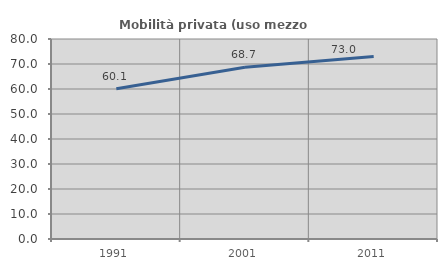
| Category | Mobilità privata (uso mezzo privato) |
|---|---|
| 1991.0 | 60.061 |
| 2001.0 | 68.69 |
| 2011.0 | 72.995 |